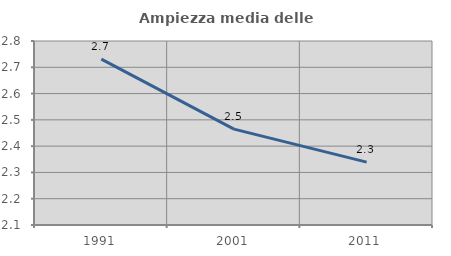
| Category | Ampiezza media delle famiglie |
|---|---|
| 1991.0 | 2.731 |
| 2001.0 | 2.465 |
| 2011.0 | 2.339 |